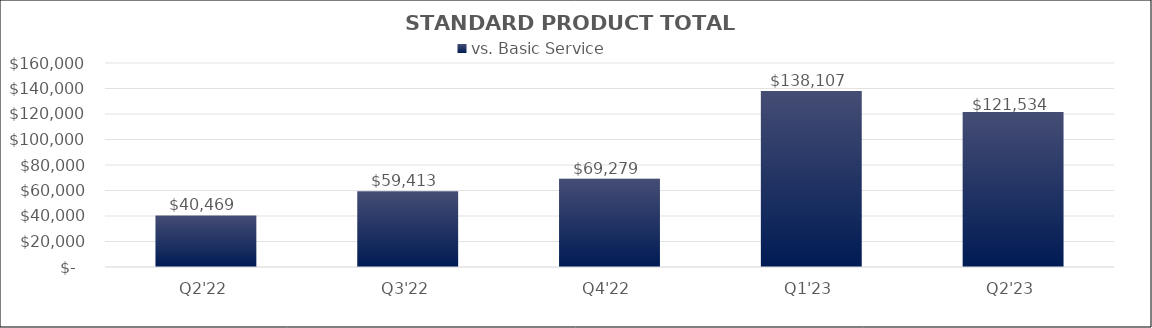
| Category | vs. Basic Service |
|---|---|
| Q2'22 | 40469.084 |
| Q3'22 | 59413.17 |
| Q4'22 | 69278.733 |
| Q1'23 | 138107.123 |
| Q2'23 | 121533.935 |